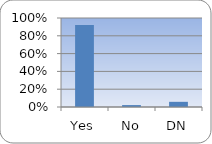
| Category | Series 0 |
|---|---|
| Yes | 0.92 |
| No | 0.022 |
| DN | 0.058 |